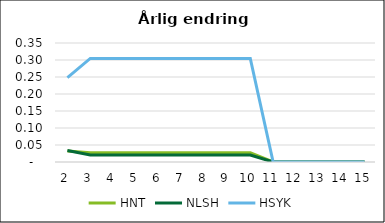
| Category | HNT | NLSH | HSYK |
|---|---|---|---|
| 2.0 | 0.032 | 0.034 | 0.248 |
| 3.0 | 0.027 | 0.02 | 0.305 |
| 4.0 | 0.027 | 0.02 | 0.305 |
| 5.0 | 0.027 | 0.02 | 0.305 |
| 6.0 | 0.027 | 0.02 | 0.305 |
| 7.0 | 0.027 | 0.02 | 0.305 |
| 8.0 | 0.027 | 0.02 | 0.305 |
| 9.0 | 0.027 | 0.02 | 0.305 |
| 10.0 | 0.027 | 0.02 | 0.305 |
| 11.0 | 0 | 0 | 0 |
| 12.0 | 0 | 0 | 0 |
| 13.0 | 0 | 0 | 0 |
| 14.0 | 0 | 0 | 0 |
| 15.0 | 0 | 0 | 0 |